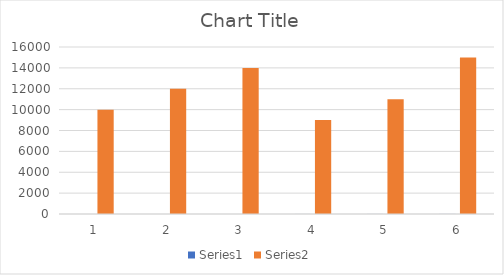
| Category | Series 0 | Series 1 |
|---|---|---|
| 0 | 1 | 10000 |
| 1 | 2 | 12000 |
| 2 | 3 | 14000 |
| 3 | 4 | 9000 |
| 4 | 5 | 11000 |
| 5 | 6 | 15000 |